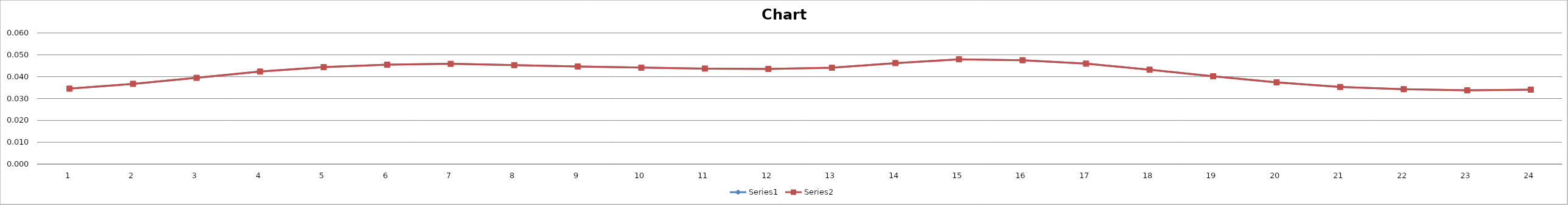
| Category | Series 0 | Series 1 |
|---|---|---|
| 0 | 0.035 | 0.035 |
| 1 | 0.037 | 0.037 |
| 2 | 0.039 | 0.039 |
| 3 | 0.042 | 0.042 |
| 4 | 0.044 | 0.044 |
| 5 | 0.045 | 0.045 |
| 6 | 0.046 | 0.046 |
| 7 | 0.045 | 0.045 |
| 8 | 0.045 | 0.045 |
| 9 | 0.044 | 0.044 |
| 10 | 0.044 | 0.044 |
| 11 | 0.044 | 0.044 |
| 12 | 0.044 | 0.044 |
| 13 | 0.046 | 0.046 |
| 14 | 0.048 | 0.048 |
| 15 | 0.048 | 0.048 |
| 16 | 0.046 | 0.046 |
| 17 | 0.043 | 0.043 |
| 18 | 0.04 | 0.04 |
| 19 | 0.037 | 0.037 |
| 20 | 0.035 | 0.035 |
| 21 | 0.034 | 0.034 |
| 22 | 0.034 | 0.034 |
| 23 | 0.034 | 0.034 |